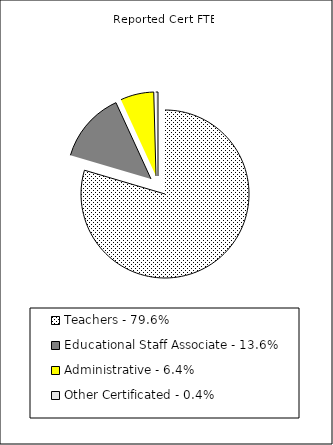
| Category | Reported FTE |
|---|---|
| Teachers - 79.6% | 62602.53 |
| Educational Staff Associate - 13.6% | 10686.06 |
| Administrative - 6.4% | 5052 |
| Other Certificated - 0.4% | 336.19 |